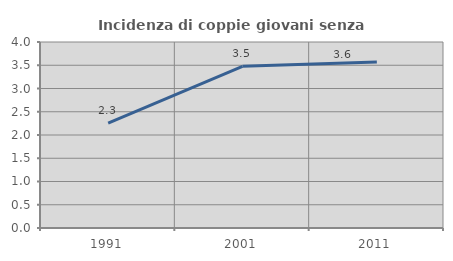
| Category | Incidenza di coppie giovani senza figli |
|---|---|
| 1991.0 | 2.256 |
| 2001.0 | 3.478 |
| 2011.0 | 3.571 |